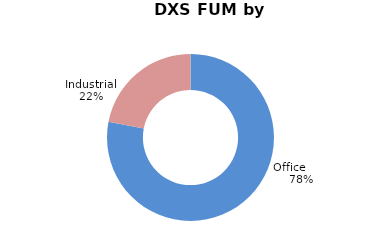
| Category | Series 0 |
|---|---|
| Office        | 0.78 |
| Industrial | 0.22 |
| Retail | 0 |
| International | 0 |